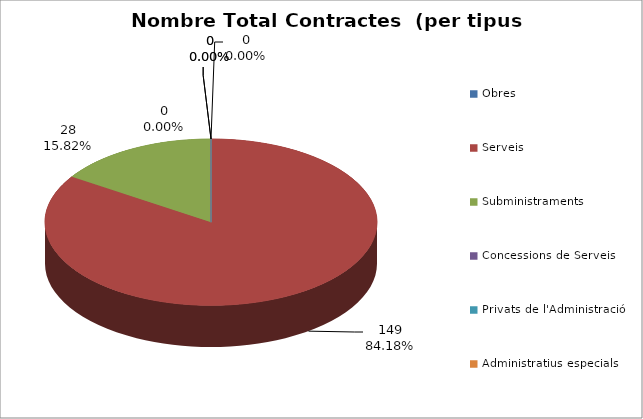
| Category | Nombre Total Contractes |
|---|---|
| Obres | 0 |
| Serveis | 149 |
| Subministraments | 28 |
| Concessions de Serveis | 0 |
| Privats de l'Administració | 0 |
| Administratius especials | 0 |